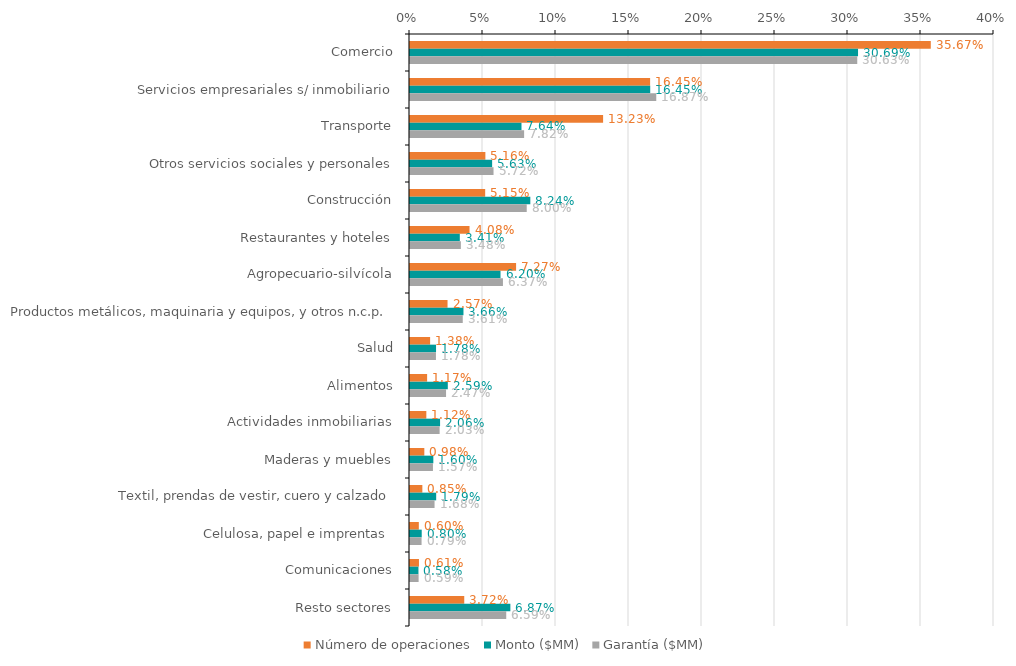
| Category | Número de operaciones | Monto ($MM) | Garantía ($MM) |
|---|---|---|---|
| Comercio | 0.357 | 0.307 | 0.306 |
| Servicios empresariales s/ inmobiliario | 0.164 | 0.165 | 0.169 |
| Transporte | 0.132 | 0.076 | 0.078 |
| Otros servicios sociales y personales | 0.052 | 0.056 | 0.057 |
| Construcción | 0.051 | 0.082 | 0.08 |
| Restaurantes y hoteles | 0.041 | 0.034 | 0.035 |
| Agropecuario-silvícola | 0.073 | 0.062 | 0.064 |
| Productos metálicos, maquinaria y equipos, y otros n.c.p. | 0.026 | 0.037 | 0.036 |
| Salud | 0.014 | 0.018 | 0.018 |
| Alimentos | 0.012 | 0.026 | 0.025 |
| Actividades inmobiliarias | 0.011 | 0.021 | 0.02 |
| Maderas y muebles | 0.01 | 0.016 | 0.016 |
| Textil, prendas de vestir, cuero y calzado | 0.008 | 0.018 | 0.017 |
| Celulosa, papel e imprentas  | 0.006 | 0.008 | 0.008 |
| Comunicaciones | 0.006 | 0.006 | 0.006 |
| Resto sectores | 0.037 | 0.069 | 0.066 |